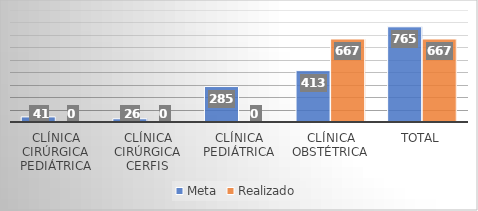
| Category | Meta | Realizado |
|---|---|---|
| Clínica Cirúrgica Pediátrica | 41 | 0 |
| Clínica Cirúrgica CERFIS | 26 | 0 |
| Clínica Pediátrica | 285 | 0 |
| Clínica Obstétrica | 413 | 667 |
| Total | 765 | 667 |